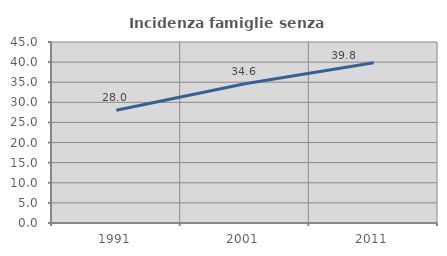
| Category | Incidenza famiglie senza nuclei |
|---|---|
| 1991.0 | 28.042 |
| 2001.0 | 34.628 |
| 2011.0 | 39.844 |